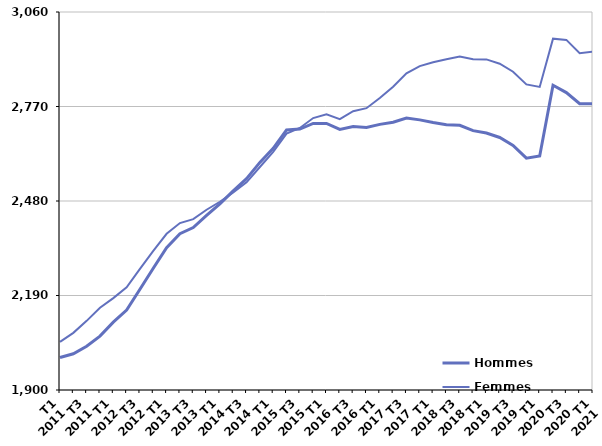
| Category | Hommes  | Femmes  |
|---|---|---|
| T1
2011 | 1999.8 | 2047.7 |
| T2
2011 | 2011.3 | 2075.4 |
| T3
2011 | 2034.3 | 2112.2 |
| T4
2011 | 2065.3 | 2152.3 |
| T1
2012 | 2108.3 | 2182 |
| T2
2012 | 2145.4 | 2215.3 |
| T3
2012 | 2209.1 | 2271.7 |
| T4
2012 | 2273.8 | 2327.1 |
| T1
2013 | 2337 | 2379.3 |
| T2
2013 | 2379.7 | 2412.2 |
| T3
2013 | 2398.4 | 2424.5 |
| T4
2013 | 2435.6 | 2453.1 |
| T1
2014 | 2471.2 | 2477.6 |
| T2
2014 | 2511 | 2506 |
| T3
2014 | 2548.5 | 2537.2 |
| T4
2014 | 2598.4 | 2584.4 |
| T1
2015 | 2641.7 | 2630.5 |
| T2
2015 | 2697.8 | 2687 |
| T3
2015 | 2700.7 | 2704.1 |
| T4
2015 | 2718 | 2734.5 |
| T1
2016 | 2718.2 | 2745.8 |
| T2
2016 | 2699.5 | 2731.3 |
| T3
2016 | 2708.6 | 2755.7 |
| T4
2016 | 2705.6 | 2764.8 |
| T1
2017 | 2715.1 | 2796.2 |
| T2
2017 | 2721.7 | 2830.9 |
| T3
2017 | 2734.7 | 2871.9 |
| T4
2017 | 2729 | 2893.8 |
| T1
2018 | 2720.8 | 2905.8 |
| T2
2018 | 2714.2 | 2915.2 |
| T3
2018 | 2712.5 | 2923.6 |
| T4
2018 | 2695.9 | 2914.8 |
| T1
2019 | 2688.5 | 2914.6 |
| T2
2019 | 2674.9 | 2901.4 |
| T3
2019 | 2650.7 | 2876.7 |
| T4
2019 | 2611.5 | 2837.7 |
| T1
2020 | 2618.1 | 2830.1 |
| T2
2020 | 2835.1 | 2978.2 |
| T3
2020 | 2812.7 | 2974.4 |
| T4
2020 | 2778.4 | 2933.8 |
| T1
2021 | 2778.4 | 2938.5 |